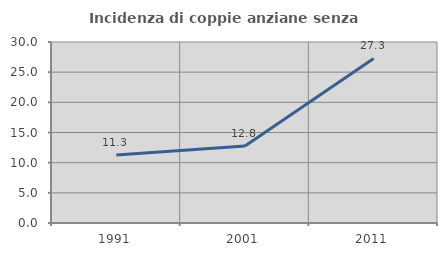
| Category | Incidenza di coppie anziane senza figli  |
|---|---|
| 1991.0 | 11.29 |
| 2001.0 | 12.766 |
| 2011.0 | 27.273 |